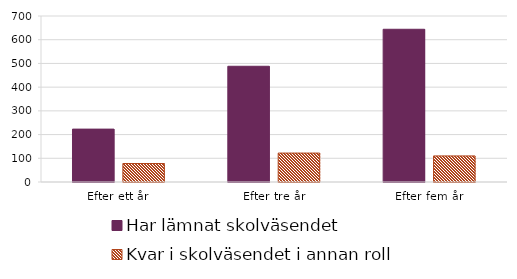
| Category | Har lämnat skolväsendet | Kvar i skolväsendet i annan roll |
|---|---|---|
| Efter ett år | 223 | 78 |
| Efter tre år | 488 | 122 |
| Efter fem år | 644 | 110 |